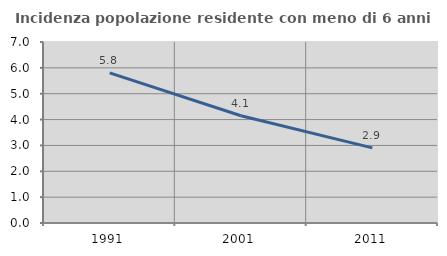
| Category | Incidenza popolazione residente con meno di 6 anni |
|---|---|
| 1991.0 | 5.805 |
| 2001.0 | 4.149 |
| 2011.0 | 2.904 |